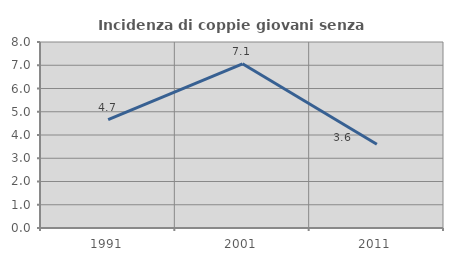
| Category | Incidenza di coppie giovani senza figli |
|---|---|
| 1991.0 | 4.66 |
| 2001.0 | 7.064 |
| 2011.0 | 3.603 |